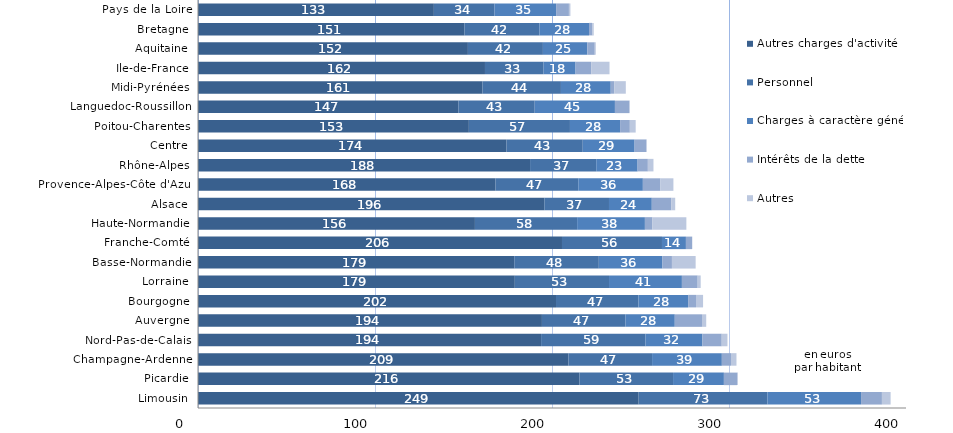
| Category | Autres charges d'activité | Personnel | Charges à caractère général | Intérêts de la dette | Autres |
|---|---|---|---|---|---|
| Limousin | 248.946 | 72.766 | 52.892 | 11.796 | 4.909 |
| Picardie | 215.503 | 52.894 | 28.72 | 7.416 | 0.485 |
| Champagne-Ardenne | 209.285 | 47.254 | 39.417 | 5.189 | 3.078 |
| Nord-Pas-de-Calais | 193.845 | 58.977 | 32.161 | 10.912 | 3.244 |
| Auvergne | 194.309 | 47.212 | 27.848 | 15.363 | 2.395 |
| Bourgogne | 202.265 | 46.584 | 28.058 | 4.459 | 3.985 |
| Lorraine | 178.991 | 53.224 | 41.177 | 8.91 | 1.705 |
| Basse-Normandie | 178.683 | 47.773 | 35.948 | 5.357 | 13.394 |
| Franche-Comté | 205.645 | 56.493 | 13.522 | 3.513 | 0.069 |
| Haute-Normandie | 156.457 | 57.743 | 38.289 | 4.269 | 19.153 |
| Alsace | 195.663 | 36.533 | 24.186 | 10.961 | 2.263 |
| Provence-Alpes-Côte d'Azur | 168.098 | 46.762 | 36.476 | 9.93 | 7.327 |
| Rhône-Alpes | 187.612 | 37.386 | 23.363 | 5.797 | 3.169 |
| Centre | 174.308 | 43.062 | 29.294 | 6.632 | 0.348 |
| Poitou-Charentes | 153.031 | 57.113 | 28.328 | 5.508 | 3.297 |
| Languedoc-Roussillon | 147.107 | 43.118 | 45.329 | 8.227 | 0.138 |
| Midi-Pyrénées | 160.726 | 44.328 | 28.134 | 1.967 | 6.545 |
| Ile-de-France | 162.133 | 33.097 | 18.075 | 8.845 | 10.35 |
| Aquitaine | 152.491 | 42.377 | 25.102 | 4.195 | 0.566 |
| Bretagne | 150.524 | 42.371 | 28.008 | 1.767 | 0.908 |
| Pays de la Loire | 133.263 | 34.254 | 34.806 | 7.24 | 0.838 |